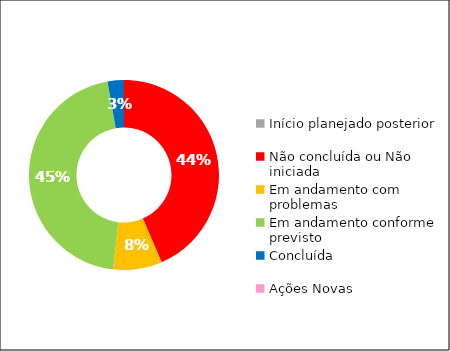
| Category | Series 0 |
|---|---|
| Início planejado posterior | 0 |
| Não concluída ou Não iniciada | 47 |
| Em andamento com problemas | 9 |
| Em andamento conforme previsto | 49 |
| Concluída | 3 |
| Ações Novas | 0 |